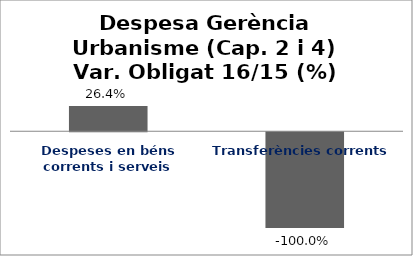
| Category | Series 0 |
|---|---|
| Despeses en béns corrents i serveis | 0.264 |
| Transferències corrents | -1 |